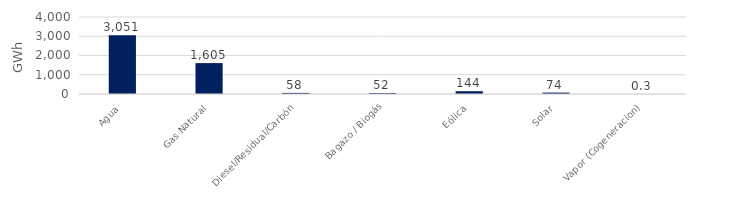
| Category | Series 0 |
|---|---|
| Agua | 3050.693 |
| Gas Natural | 1605.422 |
| Diesel/Residual/Carbón | 57.685 |
| Bagazo / Biogás | 51.503 |
| Eólica | 144.428 |
| Solar | 73.566 |
| Vapor (Cogeneracion) | 0.268 |